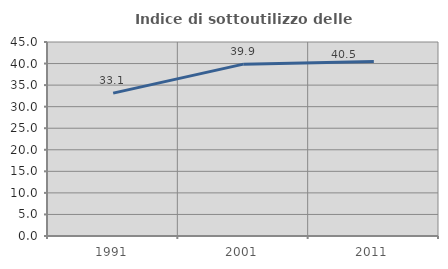
| Category | Indice di sottoutilizzo delle abitazioni  |
|---|---|
| 1991.0 | 33.141 |
| 2001.0 | 39.862 |
| 2011.0 | 40.494 |